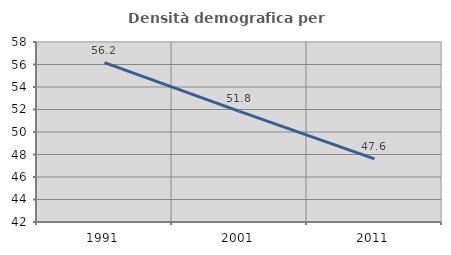
| Category | Densità demografica |
|---|---|
| 1991.0 | 56.172 |
| 2001.0 | 51.839 |
| 2011.0 | 47.608 |